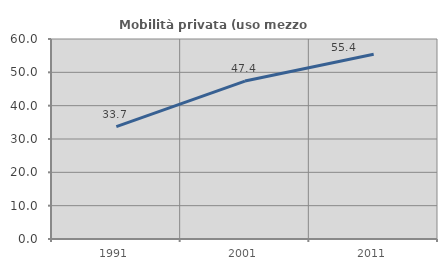
| Category | Mobilità privata (uso mezzo privato) |
|---|---|
| 1991.0 | 33.732 |
| 2001.0 | 47.376 |
| 2011.0 | 55.397 |